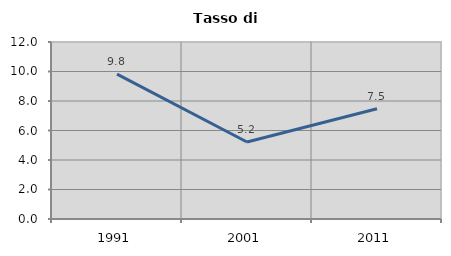
| Category | Tasso di disoccupazione   |
|---|---|
| 1991.0 | 9.817 |
| 2001.0 | 5.219 |
| 2011.0 | 7.472 |